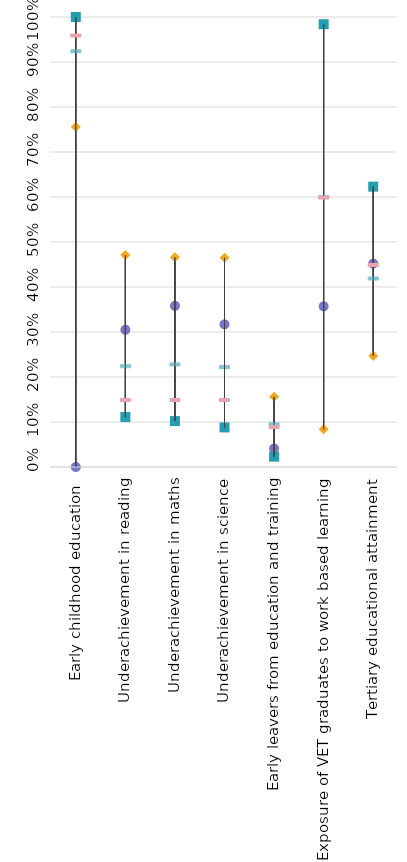
| Category | Greece | Strongest performer | Weakest performer | EU average | EU target |
|---|---|---|---|---|---|
| Early childhood education  | 0 | 1 | 0.756 | 0.925 | 0.96 |
| Underachievement in reading | 0.305 | 0.111 | 0.471 | 0.225 | 0.15 |
| Underachievement in maths | 0.358 | 0.102 | 0.466 | 0.229 | 0.15 |
| Underachievement in science | 0.317 | 0.088 | 0.465 | 0.223 | 0.15 |
| Early leavers from education and training | 0.041 | 0.023 | 0.156 | 0.096 | 0.09 |
| Exposure of VET graduates to work based learning  | 0.357 | 0.984 | 0.084 | 0.601 | 0.6 |
| Tertiary educational attainment | 0.452 | 0.623 | 0.247 | 0.42 | 0.45 |